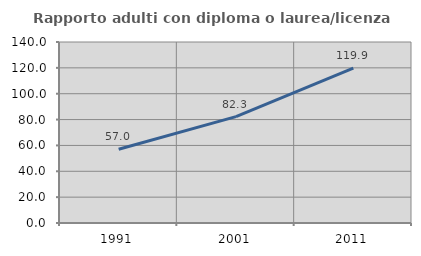
| Category | Rapporto adulti con diploma o laurea/licenza media  |
|---|---|
| 1991.0 | 57.002 |
| 2001.0 | 82.315 |
| 2011.0 | 119.862 |